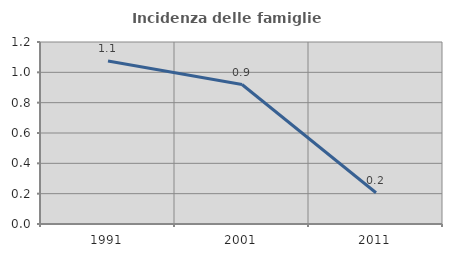
| Category | Incidenza delle famiglie numerose |
|---|---|
| 1991.0 | 1.075 |
| 2001.0 | 0.92 |
| 2011.0 | 0.206 |